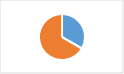
| Category | Section 3 : Intégration des différentes composantes de la LAV |
|---|---|
| 0 | 0.333 |
| 1 | 0.667 |